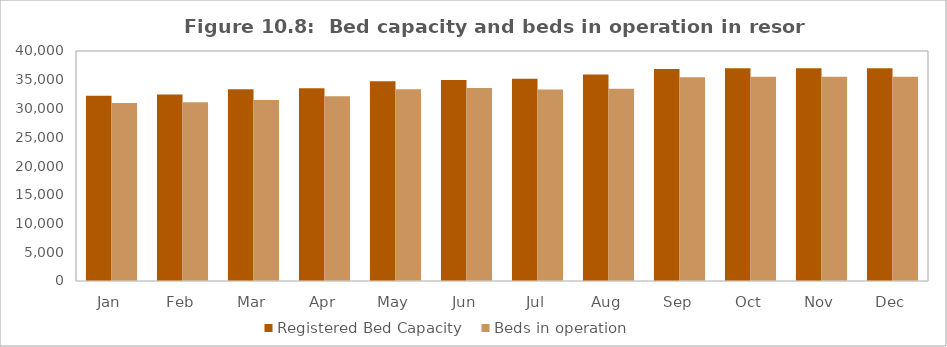
| Category | Registered Bed Capacity  | Beds in operation  |
|---|---|---|
| Jan | 32213 | 30938 |
| Feb | 32437 | 31068 |
| Mar | 33355 | 31488 |
| Apr | 33509 | 32118 |
| May | 34735 | 33352 |
| Jun | 34953 | 33581 |
| Jul | 35195 | 33302 |
| Aug | 35931 | 33422 |
| Sep | 36887 | 35427 |
| Oct | 36987 | 35527 |
| Nov | 36987 | 35527 |
| Dec | 37004 | 35527 |